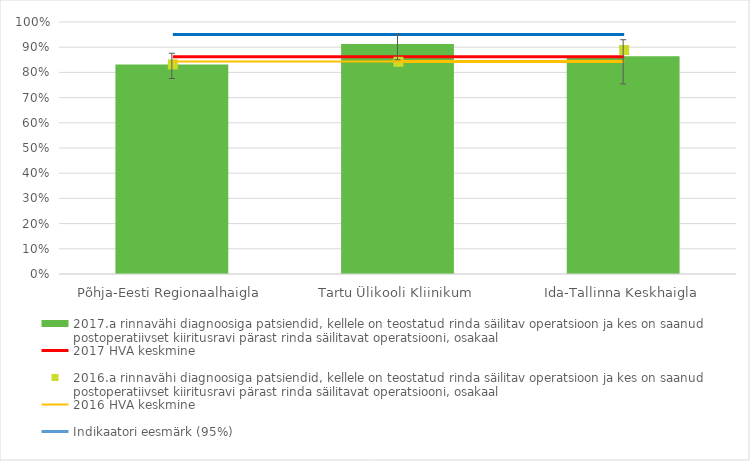
| Category | 2017.a rinnavähi diagnoosiga patsiendid, kellele on teostatud rinda säilitav operatsioon ja kes on saanud postoperatiivset kiiritusravi pärast rinda säilitavat operatsiooni, osakaal |
|---|---|
| Põhja-Eesti Regionaalhaigla | 0.832 |
| Tartu Ülikooli Kliinikum | 0.913 |
| Ida-Tallinna Keskhaigla | 0.864 |